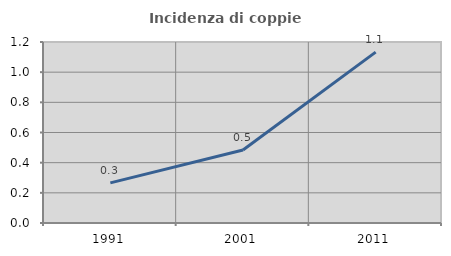
| Category | Incidenza di coppie miste |
|---|---|
| 1991.0 | 0.266 |
| 2001.0 | 0.484 |
| 2011.0 | 1.133 |